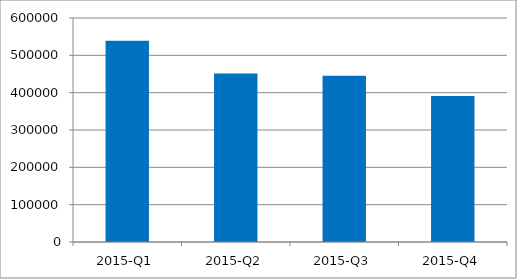
| Category | Total |
|---|---|
| 2015-Q1 | 538794 |
| 2015-Q2 | 451338 |
| 2015-Q3 | 445601 |
| 2015-Q4 | 391023 |